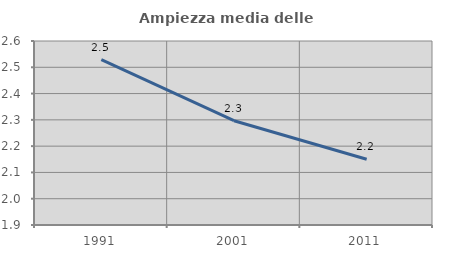
| Category | Ampiezza media delle famiglie |
|---|---|
| 1991.0 | 2.529 |
| 2001.0 | 2.297 |
| 2011.0 | 2.15 |